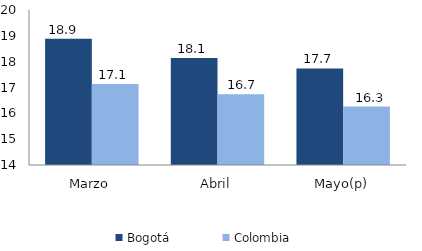
| Category | Bogotá | Colombia |
|---|---|---|
| Marzo | 18.885 | 17.132 |
| Abril | 18.138 | 16.738 |
| Mayo(p) | 17.738 | 16.261 |